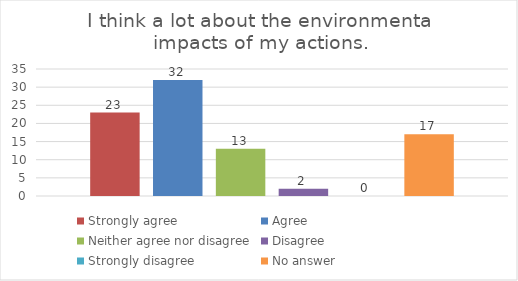
| Category | Strongly agree | Agree | Neither agree nor disagree | Disagree | Strongly disagree | No answer |
|---|---|---|---|---|---|---|
| 0 | 23 | 32 | 13 | 2 | 0 | 17 |